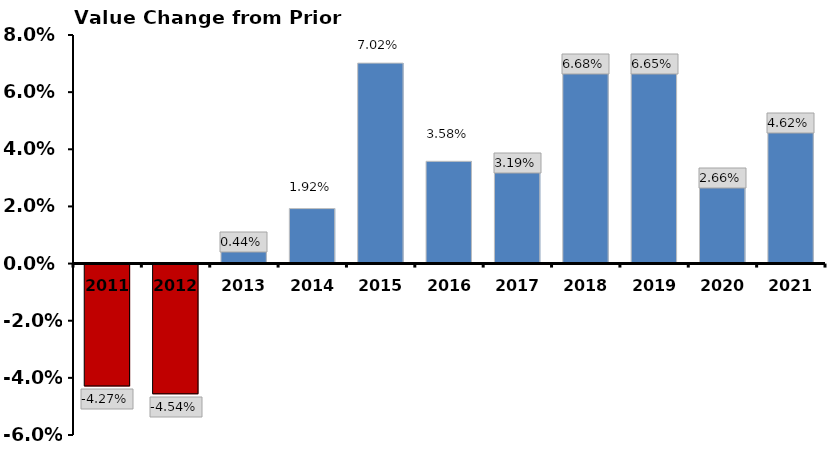
| Category | Value Change from Prior Year |
|---|---|
| 2011.0 | -0.043 |
| 2012.0 | -0.045 |
| 2013.0 | 0.004 |
| 2014.0 | 0.019 |
| 2015.0 | 0.07 |
| 2016.0 | 0.036 |
| 2017.0 | 0.032 |
| 2018.0 | 0.067 |
| 2019.0 | 0.067 |
| 2020.0 | 0.027 |
| 2021.0 | 0.046 |